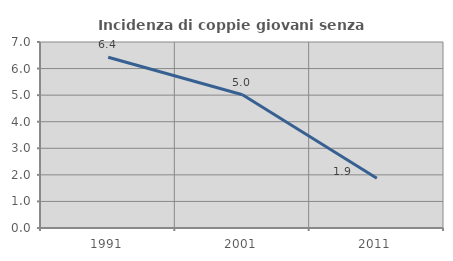
| Category | Incidenza di coppie giovani senza figli |
|---|---|
| 1991.0 | 6.424 |
| 2001.0 | 5.017 |
| 2011.0 | 1.869 |